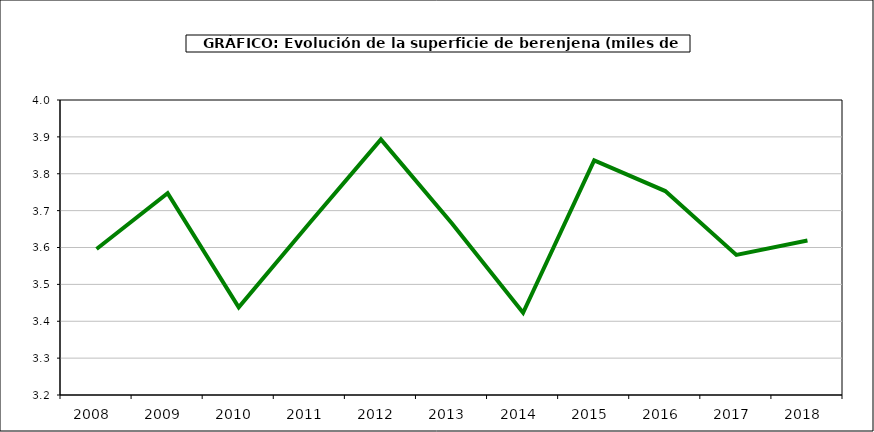
| Category | superficie |
|---|---|
| 2008.0 | 3.596 |
| 2009.0 | 3.747 |
| 2010.0 | 3.438 |
| 2011.0 | 3.667 |
| 2012.0 | 3.893 |
| 2013.0 | 3.665 |
| 2014.0 | 3.423 |
| 2015.0 | 3.836 |
| 2016.0 | 3.753 |
| 2017.0 | 3.58 |
| 2018.0 | 3.619 |